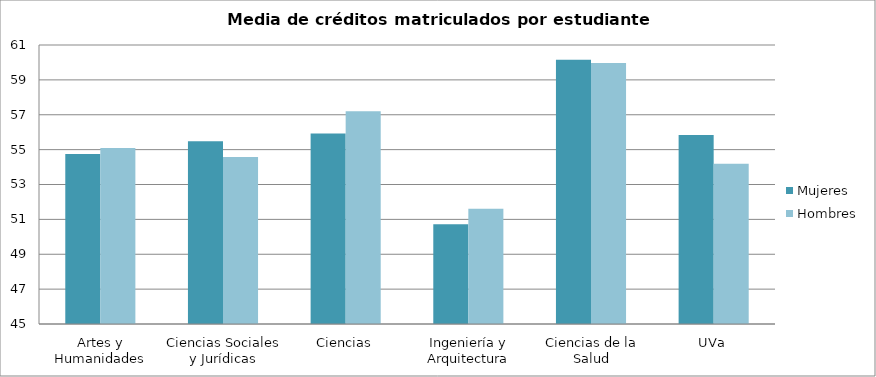
| Category | Mujeres | Hombres |
|---|---|---|
| Artes y Humanidades | 54.743 | 55.097 |
| Ciencias Sociales y Jurídicas | 55.473 | 54.579 |
| Ciencias | 55.927 | 57.204 |
| Ingeniería y Arquitectura | 50.724 | 51.613 |
| Ciencias de la Salud | 60.159 | 59.961 |
| UVa | 55.834 | 54.188 |